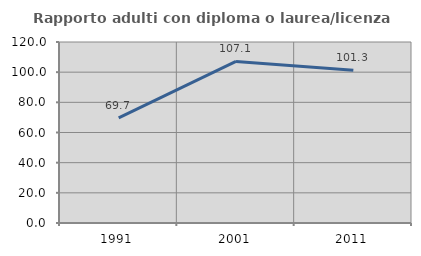
| Category | Rapporto adulti con diploma o laurea/licenza media  |
|---|---|
| 1991.0 | 69.655 |
| 2001.0 | 107.104 |
| 2011.0 | 101.316 |